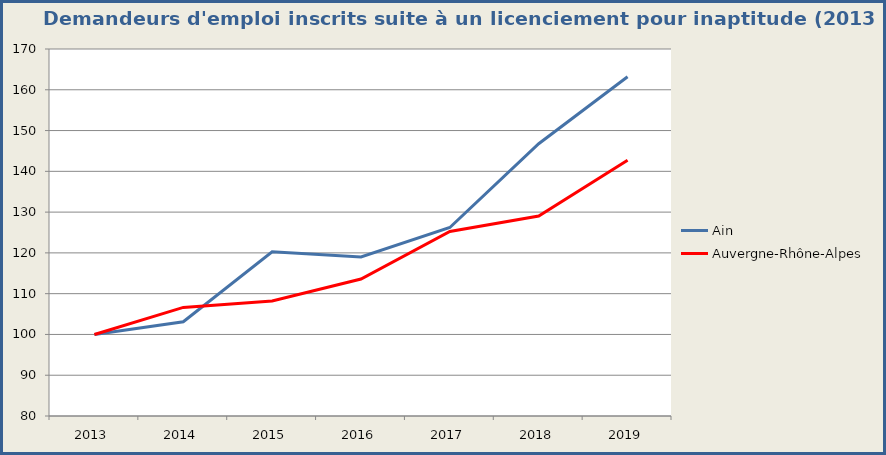
| Category | Ain | Auvergne-Rhône-Alpes |
|---|---|---|
| 2013.0 | 100 | 100 |
| 2014.0 | 103.101 | 106.627 |
| 2015.0 | 120.284 | 108.211 |
| 2016.0 | 118.992 | 113.583 |
| 2017.0 | 126.227 | 125.243 |
| 2018.0 | 146.77 | 129.055 |
| 2019.0 | 163.178 | 142.728 |